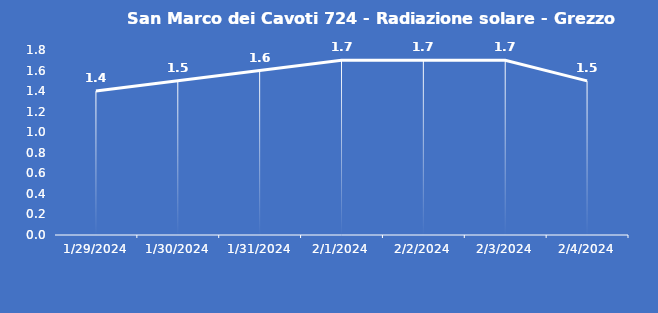
| Category | San Marco dei Cavoti 724 - Radiazione solare - Grezzo (W/m2) |
|---|---|
| 1/29/24 | 1.4 |
| 1/30/24 | 1.5 |
| 1/31/24 | 1.6 |
| 2/1/24 | 1.7 |
| 2/2/24 | 1.7 |
| 2/3/24 | 1.7 |
| 2/4/24 | 1.5 |